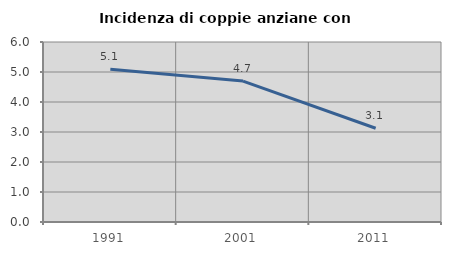
| Category | Incidenza di coppie anziane con figli |
|---|---|
| 1991.0 | 5.096 |
| 2001.0 | 4.698 |
| 2011.0 | 3.125 |